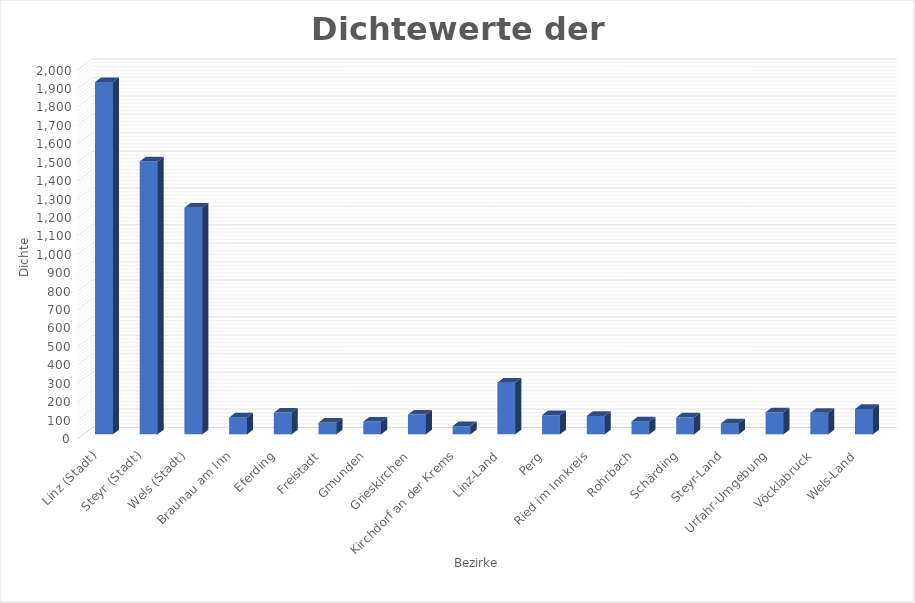
| Category | Dichte |
|---|---|
| Linz (Stadt) | 1911.898 |
| Steyr (Stadt) | 1481.175 |
| Wels (Stadt) | 1229.922 |
| Braunau am Inn | 91.494 |
| Eferding | 118 |
| Freistadt | 64 |
| Gmunden | 69.352 |
| Grieskirchen | 107.014 |
| Kirchdorf an der Krems | 44.497 |
| Linz-Land | 280.411 |
| Perg | 104.243 |
| Ried im Innkreis | 99.491 |
| Rohrbach | 69.943 |
| Schärding | 92.153 |
| Steyr-Land | 59.289 |
| Urfahr-Umgebung | 119.726 |
| Vöcklabruck | 116.761 |
| Wels-Land | 137.666 |